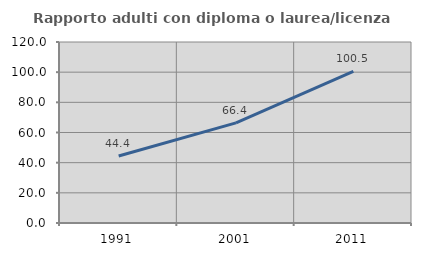
| Category | Rapporto adulti con diploma o laurea/licenza media  |
|---|---|
| 1991.0 | 44.444 |
| 2001.0 | 66.405 |
| 2011.0 | 100.534 |